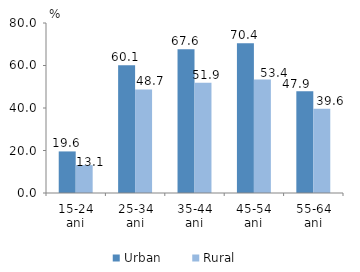
| Category | Urban | Rural |
|---|---|---|
| 15-24 ani | 19.562 | 13.13 |
| 25-34 ani | 60.07 | 48.713 |
| 35-44 ani | 67.63 | 51.87 |
| 45-54 ani | 70.416 | 53.392 |
| 55-64 ani | 47.851 | 39.646 |